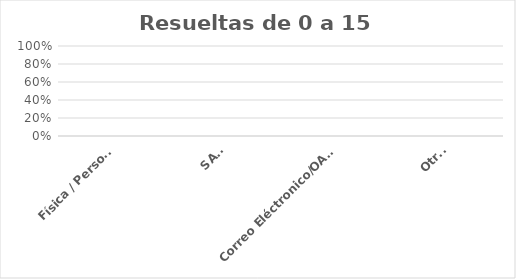
| Category | Series 0 |
|---|---|
| Física / Personal | 0 |
| SAIP | 0 |
| Correo Eléctronico/OAI/Info/Contacto | 0 |
| Otras | 0 |